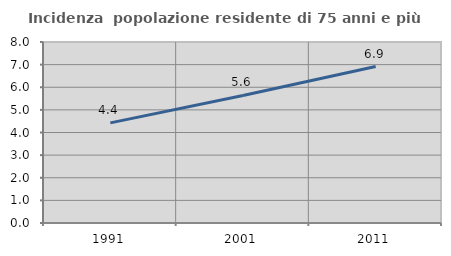
| Category | Incidenza  popolazione residente di 75 anni e più |
|---|---|
| 1991.0 | 4.425 |
| 2001.0 | 5.636 |
| 2011.0 | 6.915 |